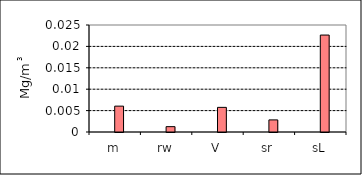
| Category | Series 1 | Series 0 | Series 5 | Series 6 |
|---|---|---|---|---|
| m |  |  | 0.006 |  |
| rw |  |  | 0.001 |  |
| V |  |  | 0.006 |  |
| sr |  |  | 0.003 |  |
| sL |  |  | 0.023 |  |